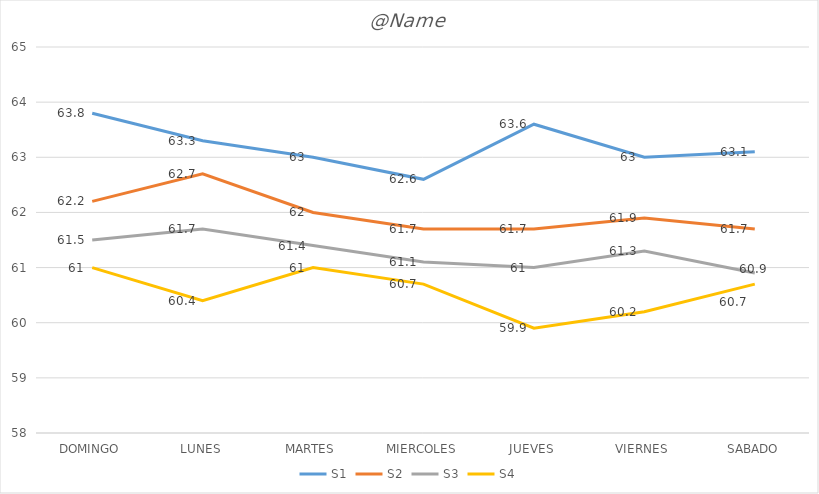
| Category | S1 | S2 | S3 | S4 |
|---|---|---|---|---|
| DOMINGO | 63.8 | 62.2 | 61.5 | 61 |
| LUNES | 63.3 | 62.7 | 61.7 | 60.4 |
| MARTES | 63 | 62 | 61.4 | 61 |
| MIERCOLES | 62.6 | 61.7 | 61.1 | 60.7 |
| JUEVES | 63.6 | 61.7 | 61 | 59.9 |
| VIERNES | 63 | 61.9 | 61.3 | 60.2 |
| SABADO | 63.1 | 61.7 | 60.9 | 60.7 |